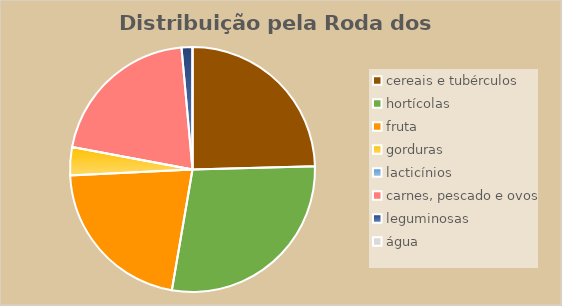
| Category | Series 0 |
|---|---|
| cereais e tubérculos | 0.285 |
| hortícolas | 0.327 |
| fruta | 0.25 |
| gorduras | 0.043 |
| lacticínios | 0 |
| carnes, pescado e ovos | 0.24 |
| leguminosas | 0.017 |
| água | 0 |